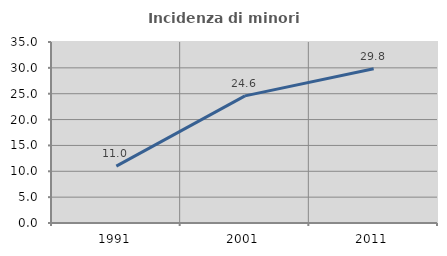
| Category | Incidenza di minori stranieri |
|---|---|
| 1991.0 | 11 |
| 2001.0 | 24.578 |
| 2011.0 | 29.844 |